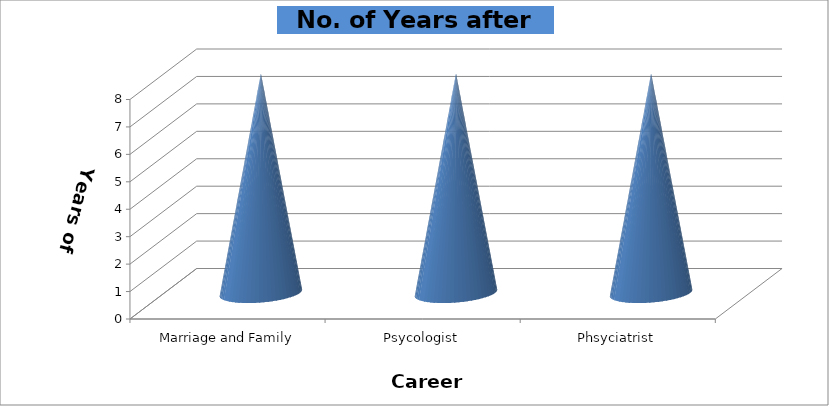
| Category | Series 0 |
|---|---|
| Marriage and Family Therapist | 8 |
| Psycologist | 8 |
| Phsyciatrist | 8 |